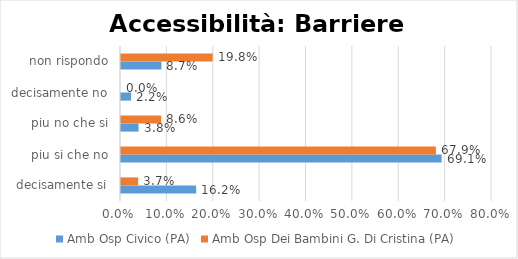
| Category | Amb Osp Civico (PA) | Amb Osp Dei Bambini G. Di Cristina (PA) |
|---|---|---|
| decisamente si | 0.162 | 0.037 |
| piu si che no | 0.691 | 0.679 |
| piu no che si | 0.038 | 0.086 |
| decisamente no | 0.022 | 0 |
| non rispondo | 0.087 | 0.198 |